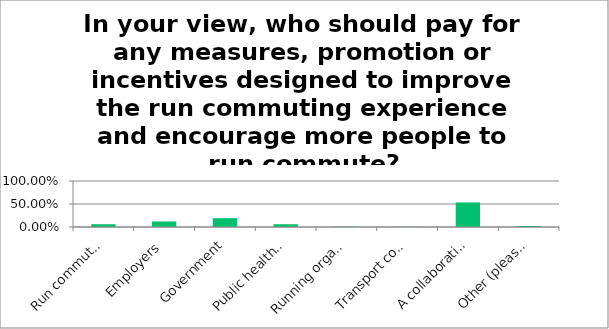
| Category | Responses |
|---|---|
| Run commuters | 0.06 |
| Employers | 0.121 |
| Government | 0.192 |
| Public health organisations | 0.06 |
| Running organisations | 0.007 |
| Transport companies/organisations | 0.004 |
| A collaboration between some/all of these | 0.534 |
| Other (please specify) | 0.021 |